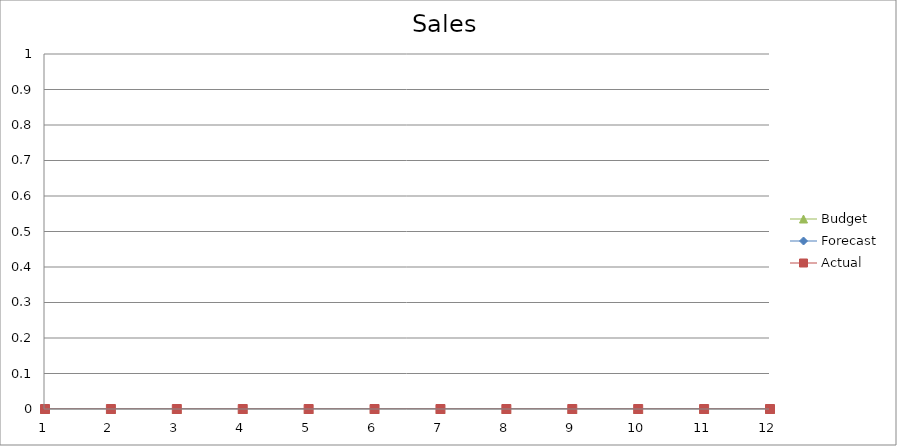
| Category | Budget | Forecast | Actual |
|---|---|---|---|
| 0 | 2180 | 2080 | 1640 |
| 1 | 1080 | 600 | 1410 |
| 2 | 970 | 3160 | 1090 |
| 3 | 2730 | 650 | 2890 |
| 4 | 2650 | 3070 | 520 |
| 5 | 2620 | 2150 | 760 |
| 6 | 610 | 2290 | 2140 |
| 7 | 2290 | 2940 | 2840 |
| 8 | 2470 | 2010 | 2520 |
| 9 | 2930 | 2750 | 1850 |
| 10 | 750 | 3040 | 1330 |
| 11 | 3440 | 2620 | 2340 |